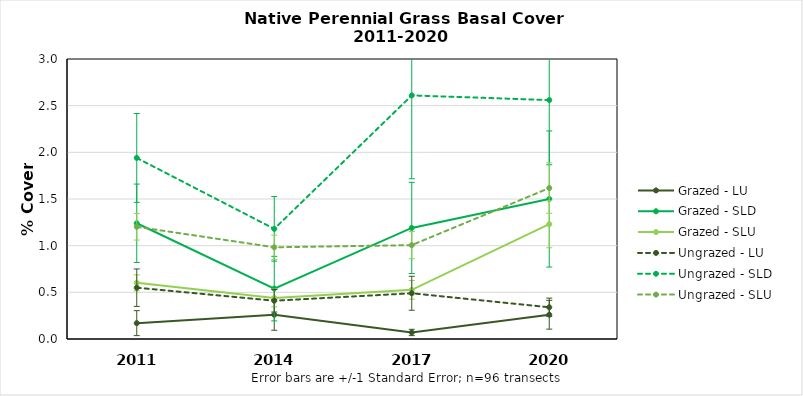
| Category | Grazed - LU | Grazed - SLD | Grazed - SLU | Ungrazed - LU | Ungrazed - SLD | Ungrazed - SLU |
|---|---|---|---|---|---|---|
| 2011.0 | 0.17 | 1.24 | 0.602 | 0.55 | 1.94 | 1.202 |
| 2014.0 | 0.26 | 0.54 | 0.44 | 0.41 | 1.18 | 0.983 |
| 2017.0 | 0.07 | 1.19 | 0.527 | 0.49 | 2.61 | 1.006 |
| 2020.0 | 0.26 | 1.5 | 1.231 | 0.34 | 2.56 | 1.617 |